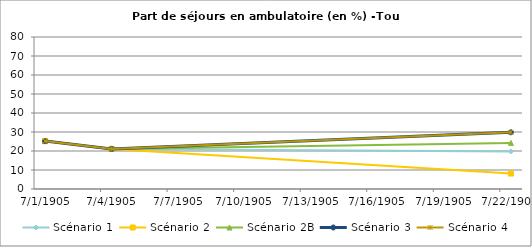
| Category | Scénario 1 | Scénario 2 | Scénario 2B | Scénario 3 | Scénario 4 |
|---|---|---|---|---|---|
| 2009.0 | 25.21 | 25.21 | 25.21 | 25.21 | 25.21 |
| 2012.0 | 21.105 | 21.105 | 21.105 | 21.105 | 21.105 |
| 2030.0 | 19.777 | 8.127 | 24.269 | 29.839 | 29.839 |